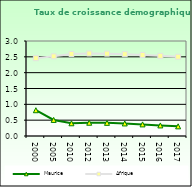
| Category | Maurice | Afrique                        |
|---|---|---|
| 2000.0 | 0.814 | 2.458 |
| 2005.0 | 0.508 | 2.516 |
| 2010.0 | 0.402 | 2.59 |
| 2012.0 | 0.419 | 2.606 |
| 2013.0 | 0.415 | 2.601 |
| 2014.0 | 0.396 | 2.584 |
| 2015.0 | 0.366 | 2.559 |
| 2016.0 | 0.334 | 2.531 |
| 2017.0 | 0.305 | 2.503 |